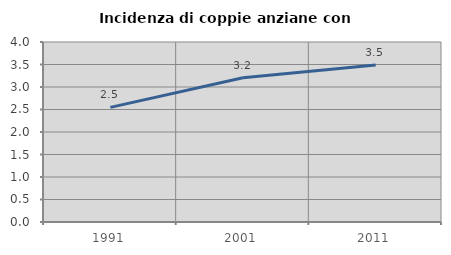
| Category | Incidenza di coppie anziane con figli |
|---|---|
| 1991.0 | 2.548 |
| 2001.0 | 3.205 |
| 2011.0 | 3.488 |